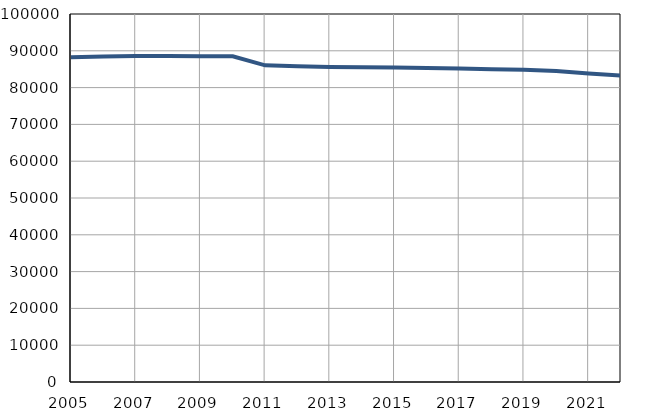
| Category | Population
size |
|---|---|
| 2005.0 | 88271 |
| 2006.0 | 88439 |
| 2007.0 | 88602 |
| 2008.0 | 88608 |
| 2009.0 | 88532 |
| 2010.0 | 88504 |
| 2011.0 | 86046 |
| 2012.0 | 85771 |
| 2013.0 | 85607 |
| 2014.0 | 85555 |
| 2015.0 | 85463 |
| 2016.0 | 85340 |
| 2017.0 | 85180 |
| 2018.0 | 85012 |
| 2019.0 | 84880 |
| 2020.0 | 84520 |
| 2021.0 | 83808 |
| 2022.0 | 83275 |